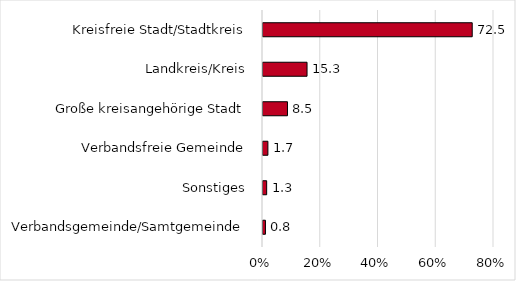
| Category | Series 0 |
|---|---|
| Verbandsgemeinde/Samtgemeinde | 0.847 |
| Sonstiges | 1.271 |
| Verbandsfreie Gemeinde | 1.695 |
| Große kreisangehörige Stadt | 8.475 |
| Landkreis/Kreis | 15.254 |
| Kreisfreie Stadt/Stadtkreis | 72.458 |